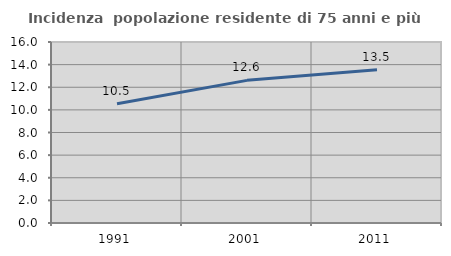
| Category | Incidenza  popolazione residente di 75 anni e più |
|---|---|
| 1991.0 | 10.544 |
| 2001.0 | 12.61 |
| 2011.0 | 13.542 |